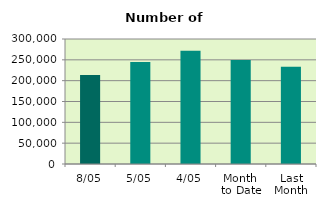
| Category | Series 0 |
|---|---|
| 8/05 | 213474 |
| 5/05 | 244830 |
| 4/05 | 271788 |
| Month 
to Date | 249608 |
| Last
Month | 233247 |